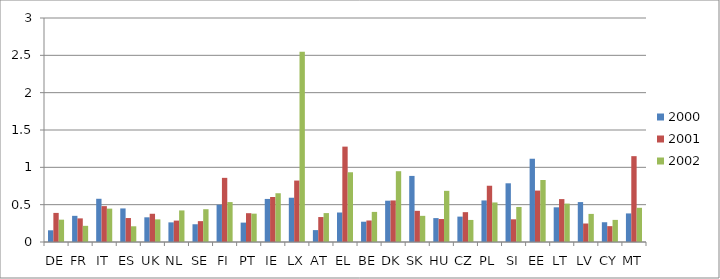
| Category | 2000 | 2001 | 2002 |
|---|---|---|---|
| DE | 0.157 | 0.39 | 0.299 |
| FR | 0.35 | 0.316 | 0.216 |
| IT | 0.579 | 0.481 | 0.447 |
| ES | 0.45 | 0.321 | 0.21 |
| UK | 0.331 | 0.378 | 0.303 |
| NL | 0.263 | 0.287 | 0.423 |
| SE | 0.238 | 0.279 | 0.439 |
| FI | 0.499 | 0.859 | 0.535 |
| PT | 0.26 | 0.386 | 0.38 |
| IE | 0.577 | 0.602 | 0.653 |
| LX | 0.593 | 0.823 | 2.548 |
| AT | 0.159 | 0.334 | 0.387 |
| EL | 0.395 | 1.277 | 0.934 |
| BE | 0.272 | 0.288 | 0.403 |
| DK | 0.553 | 0.557 | 0.948 |
| SK | 0.885 | 0.418 | 0.35 |
| HU | 0.32 | 0.308 | 0.685 |
| CZ | 0.34 | 0.4 | 0.295 |
| PL | 0.557 | 0.754 | 0.53 |
| SI | 0.786 | 0.304 | 0.469 |
| EE | 1.115 | 0.689 | 0.83 |
| LT | 0.464 | 0.575 | 0.514 |
| LV | 0.535 | 0.248 | 0.376 |
| CY | 0.265 | 0.212 | 0.296 |
| MT | 0.383 | 1.15 | 0.458 |